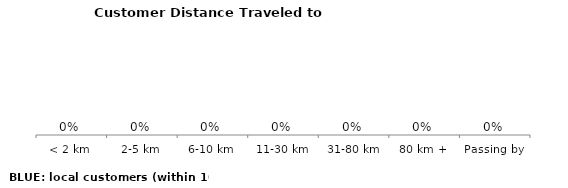
| Category | Series 0 |
|---|---|
| < 2 km | 0 |
| 2-5 km | 0 |
| 6-10 km | 0 |
| 11-30 km | 0 |
| 31-80 km | 0 |
| 80 km + | 0 |
| Passing by | 0 |